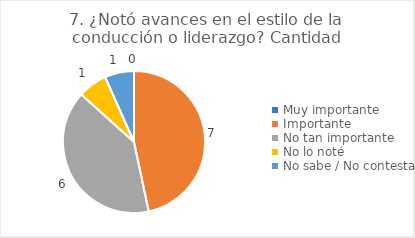
| Category | 7. ¿Notó avances en el estilo de la conducción o liderazgo? |
|---|---|
| Muy importante  | 0 |
| Importante  | 0.467 |
| No tan importante  | 0.4 |
| No lo noté  | 0.067 |
| No sabe / No contesta | 0.067 |